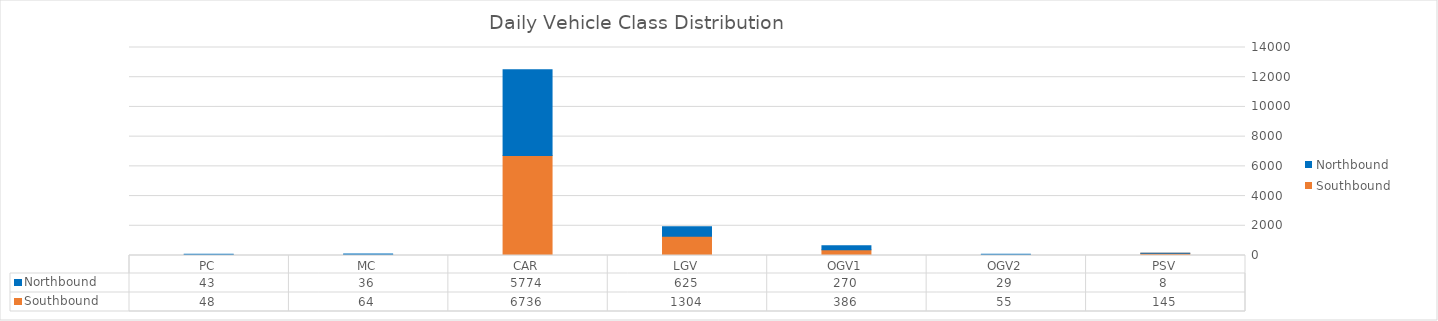
| Category | Southbound | Northbound |
|---|---|---|
| PC | 48 | 43 |
| MC | 64 | 36 |
| CAR | 6736 | 5774 |
| LGV | 1304 | 625 |
| OGV1 | 386 | 270 |
| OGV2 | 55 | 29 |
| PSV | 145 | 8 |